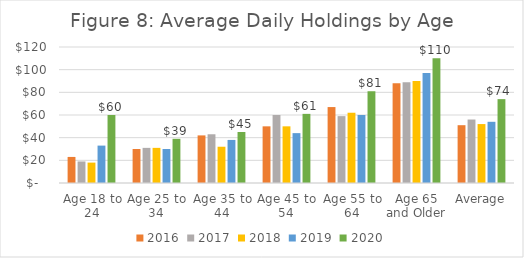
| Category | 2016 | 2017 | 2018 | 2019 | 2020 |
|---|---|---|---|---|---|
| Age 18 to 24 | 23 | 19 | 18 | 33 | 60 |
| Age 25 to 34 | 30 | 31 | 31 | 30 | 39 |
| Age 35 to 44 | 42 | 43 | 32 | 38 | 45 |
| Age 45 to 54 | 50 | 60 | 50 | 44 | 61 |
| Age 55 to 64 | 67 | 59 | 62 | 60 | 81 |
| Age 65 and Older | 88 | 89 | 90 | 97 | 110 |
| Average | 51 | 56 | 52 | 54 | 74 |